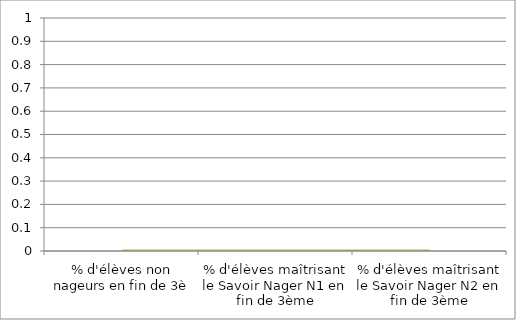
| Category | Series 2 |
|---|---|
| % d'élèves non nageurs en fin de 3è | 0 |
| % d'élèves maîtrisant le Savoir Nager N1 en fin de 3ème | 0 |
| % d'élèves maîtrisant le Savoir Nager N2 en fin de 3ème | 0 |